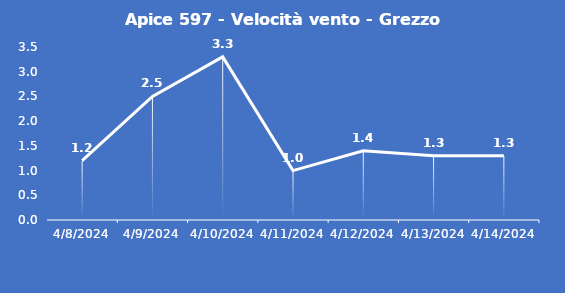
| Category | Apice 597 - Velocità vento - Grezzo (m/s) |
|---|---|
| 4/8/24 | 1.2 |
| 4/9/24 | 2.5 |
| 4/10/24 | 3.3 |
| 4/11/24 | 1 |
| 4/12/24 | 1.4 |
| 4/13/24 | 1.3 |
| 4/14/24 | 1.3 |